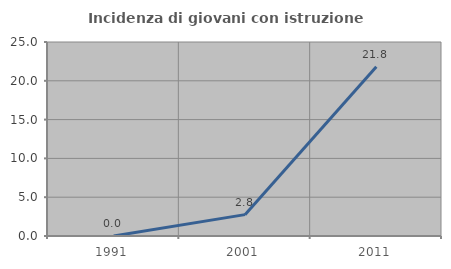
| Category | Incidenza di giovani con istruzione universitaria |
|---|---|
| 1991.0 | 0 |
| 2001.0 | 2.752 |
| 2011.0 | 21.818 |